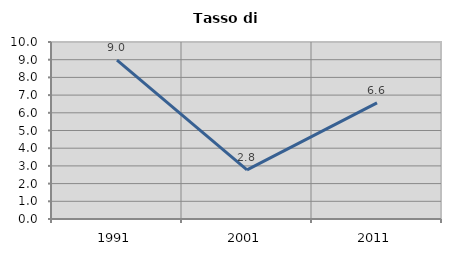
| Category | Tasso di disoccupazione   |
|---|---|
| 1991.0 | 8.974 |
| 2001.0 | 2.771 |
| 2011.0 | 6.557 |